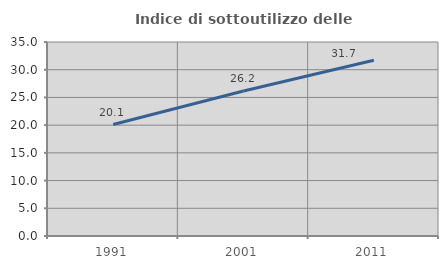
| Category | Indice di sottoutilizzo delle abitazioni  |
|---|---|
| 1991.0 | 20.112 |
| 2001.0 | 26.156 |
| 2011.0 | 31.699 |